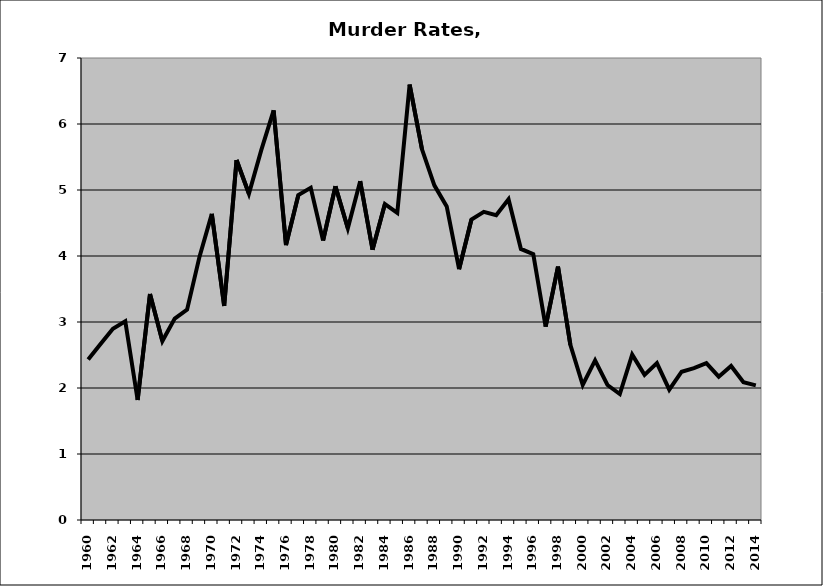
| Category | Murder |
|---|---|
| 1960.0 | 2.431 |
| 1961.0 | 2.668 |
| 1962.0 | 2.897 |
| 1963.0 | 3.012 |
| 1964.0 | 1.817 |
| 1965.0 | 3.423 |
| 1966.0 | 2.711 |
| 1967.0 | 3.052 |
| 1968.0 | 3.187 |
| 1969.0 | 3.986 |
| 1970.0 | 4.638 |
| 1971.0 | 3.244 |
| 1972.0 | 5.454 |
| 1973.0 | 4.944 |
| 1974.0 | 5.605 |
| 1975.0 | 6.206 |
| 1976.0 | 4.165 |
| 1977.0 | 4.924 |
| 1978.0 | 5.033 |
| 1979.0 | 4.234 |
| 1980.0 | 5.057 |
| 1981.0 | 4.42 |
| 1982.0 | 5.134 |
| 1983.0 | 4.095 |
| 1984.0 | 4.787 |
| 1985.0 | 4.652 |
| 1986.0 | 6.597 |
| 1987.0 | 5.617 |
| 1988.0 | 5.071 |
| 1989.0 | 4.752 |
| 1990.0 | 3.8 |
| 1991.0 | 4.552 |
| 1992.0 | 4.669 |
| 1993.0 | 4.617 |
| 1994.0 | 4.861 |
| 1995.0 | 4.107 |
| 1996.0 | 4.026 |
| 1997.0 | 2.929 |
| 1998.0 | 3.839 |
| 1999.0 | 2.654 |
| 2000.0 | 2.046 |
| 2001.0 | 2.418 |
| 2002.0 | 2.045 |
| 2003.0 | 1.908 |
| 2004.0 | 2.506 |
| 2005.0 | 2.198 |
| 2006.0 | 2.378 |
| 2007.0 | 1.975 |
| 2008.0 | 2.247 |
| 2009.0 | 2.3 |
| 2010.0 | 2.375 |
| 2011.0 | 2.172 |
| 2012.0 | 2.333 |
| 2013.0 | 2.088 |
| 2014.0 | 2.04 |